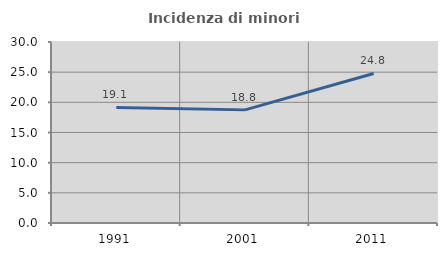
| Category | Incidenza di minori stranieri |
|---|---|
| 1991.0 | 19.149 |
| 2001.0 | 18.75 |
| 2011.0 | 24.784 |